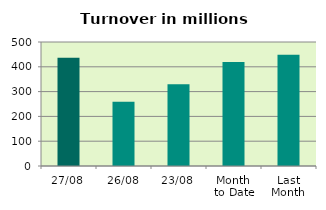
| Category | Series 0 |
|---|---|
| 27/08 | 436.206 |
| 26/08 | 259.14 |
| 23/08 | 329.962 |
| Month 
to Date | 418.962 |
| Last
Month | 448.907 |